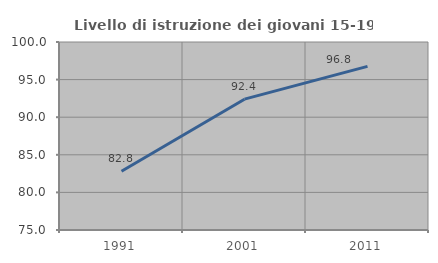
| Category | Livello di istruzione dei giovani 15-19 anni |
|---|---|
| 1991.0 | 82.812 |
| 2001.0 | 92.398 |
| 2011.0 | 96.764 |